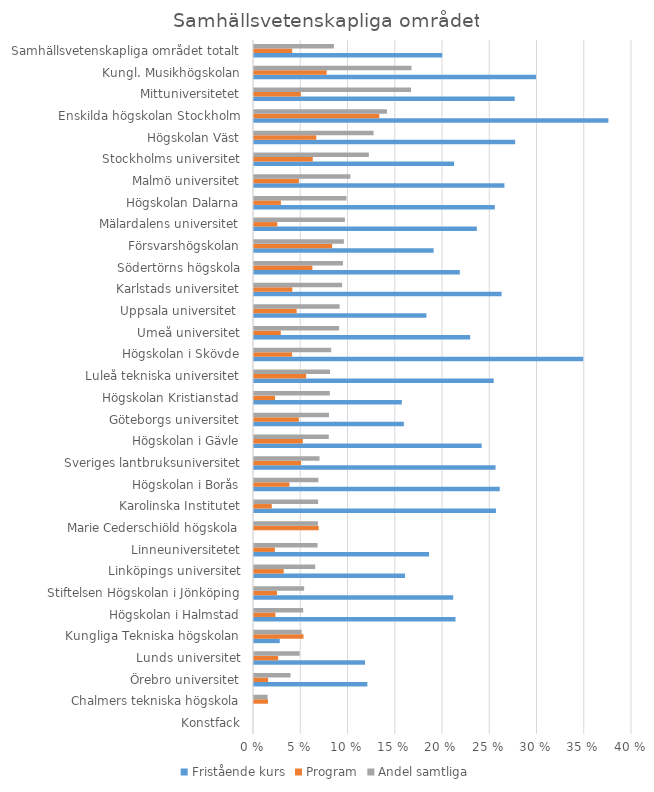
| Category | Fristående kurs | Program | Andel samtliga |
|---|---|---|---|
| Konstfack | 0 | 0 | 0 |
| Chalmers tekniska högskola | 0 | 0.015 | 0.014 |
| Örebro universitet | 0.12 | 0.015 | 0.039 |
| Lunds universitet | 0.117 | 0.026 | 0.048 |
| Kungliga Tekniska högskolan | 0.027 | 0.052 | 0.05 |
| Högskolan i Halmstad | 0.213 | 0.023 | 0.052 |
| Stiftelsen Högskolan i Jönköping | 0.211 | 0.024 | 0.053 |
| Linköpings universitet | 0.16 | 0.031 | 0.065 |
| Linneuniversitetet | 0.185 | 0.022 | 0.067 |
| Marie Cederschiöld högskola | 0 | 0.068 | 0.068 |
| Karolinska Institutet | 0.256 | 0.019 | 0.068 |
| Högskolan i Borås | 0.26 | 0.037 | 0.068 |
| Sveriges lantbruksuniversitet | 0.256 | 0.05 | 0.069 |
| Högskolan i Gävle | 0.241 | 0.052 | 0.079 |
| Göteborgs universitet | 0.159 | 0.047 | 0.079 |
| Högskolan Kristianstad | 0.156 | 0.022 | 0.08 |
| Luleå tekniska universitet | 0.254 | 0.055 | 0.08 |
| Högskolan i Skövde | 0.348 | 0.04 | 0.082 |
| Umeå universitet | 0.229 | 0.028 | 0.09 |
| Uppsala universitet  | 0.182 | 0.045 | 0.091 |
| Karlstads universitet | 0.262 | 0.041 | 0.093 |
| Södertörns högskola | 0.218 | 0.062 | 0.094 |
| Försvarshögskolan | 0.19 | 0.083 | 0.095 |
| Mälardalens universitet | 0.236 | 0.025 | 0.096 |
| Högskolan Dalarna | 0.255 | 0.028 | 0.098 |
| Malmö universitet | 0.265 | 0.048 | 0.102 |
| Stockholms universitet | 0.212 | 0.062 | 0.122 |
| Högskolan Väst | 0.276 | 0.066 | 0.127 |
| Enskilda högskolan Stockholm | 0.375 | 0.133 | 0.141 |
| Mittuniversitetet | 0.276 | 0.05 | 0.166 |
| Kungl. Musikhögskolan | 0.298 | 0.077 | 0.167 |
| Samhällsvetenskapliga området totalt | 0.199 | 0.04 | 0.085 |